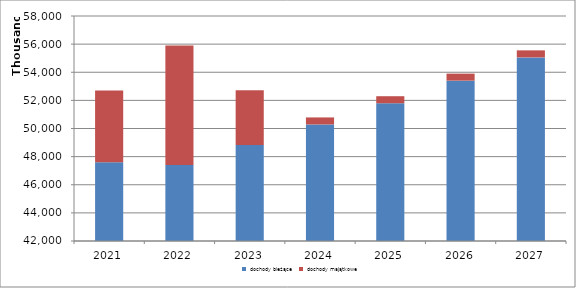
| Category | dochody bieżące | dochody majątkowe |
|---|---|---|
| 2021.0 | 47601770 | 5103624 |
| 2022.0 | 47400754 | 8500000 |
| 2023.0 | 48822776 | 3900000 |
| 2024.0 | 50287460 | 500000 |
| 2025.0 | 51796084 | 500000 |
| 2026.0 | 53401762 | 500000 |
| 2027.0 | 55057217 | 500000 |